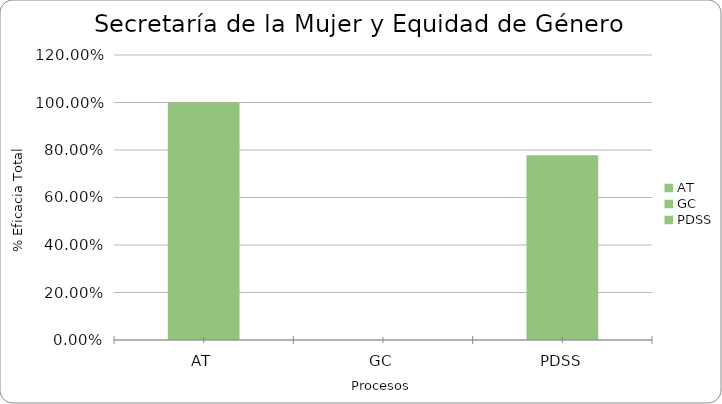
| Category | % Eficacia total |
|---|---|
| AT | 1 |
| GC | 0 |
| PDSS | 0.778 |